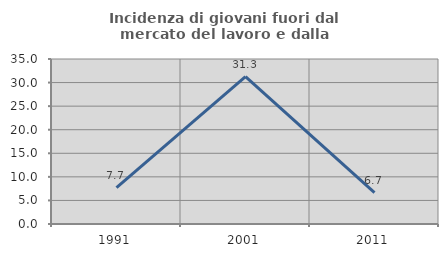
| Category | Incidenza di giovani fuori dal mercato del lavoro e dalla formazione  |
|---|---|
| 1991.0 | 7.692 |
| 2001.0 | 31.25 |
| 2011.0 | 6.667 |